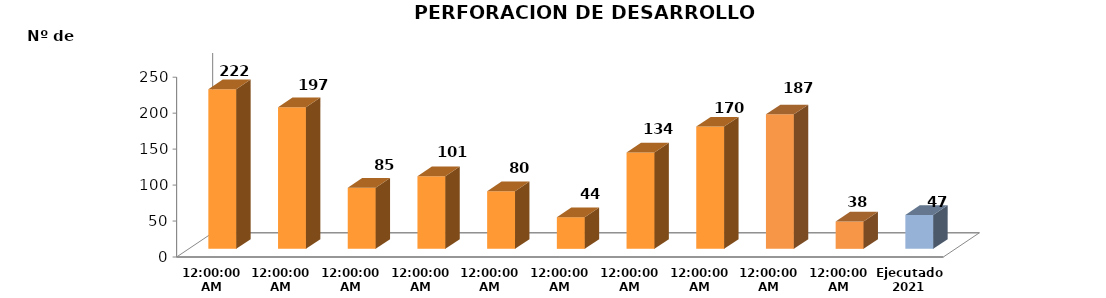
| Category | Series 0 |
|---|---|
| 2011 | 222 |
| 2012 | 197 |
| 2013 | 85 |
| 2014 | 101 |
| 2015 | 80 |
| 2016 | 44 |
| 2017 | 134 |
| 2018 | 170 |
| 2019 | 187 |
| 2020 | 38 |
| Ejecutado
2021 | 47 |